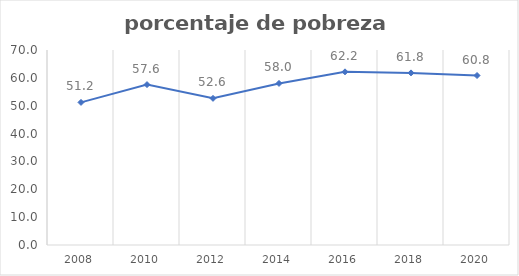
| Category | Series 0 |
|---|---|
| 2008.0 | 51.191 |
| 2010.0 | 57.579 |
| 2012.0 | 52.644 |
| 2014.0 | 58.005 |
| 2016.0 | 62.16 |
| 2018.0 | 61.779 |
| 2020.0 | 60.846 |